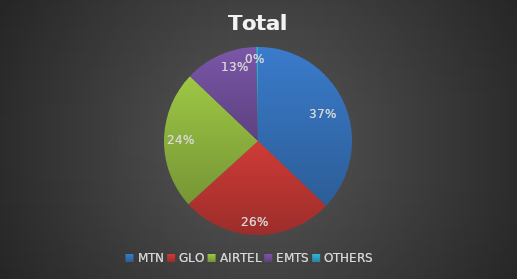
| Category | Total Voice |
|---|---|
| MTN | 53093756 |
| GLO | 37411407 |
| AIRTEL | 34126900 |
| EMTS | 18022674 |
| OTHERS | 409753 |